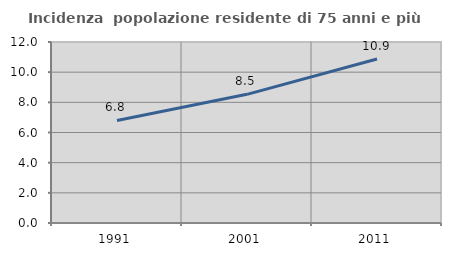
| Category | Incidenza  popolazione residente di 75 anni e più |
|---|---|
| 1991.0 | 6.8 |
| 2001.0 | 8.531 |
| 2011.0 | 10.873 |